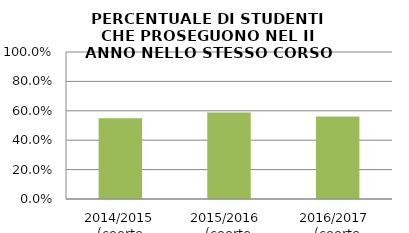
| Category | 2014/2015 (coorte 2013/14) 2015/2016  (coorte 2014/15) 2016/2017  (coorte 2015/16) |
|---|---|
| 2014/2015 (coorte 2013/14) | 0.549 |
| 2015/2016  (coorte 2014/15) | 0.589 |
| 2016/2017  (coorte 2015/16) | 0.561 |